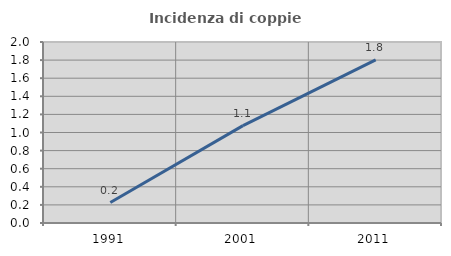
| Category | Incidenza di coppie miste |
|---|---|
| 1991.0 | 0.227 |
| 2001.0 | 1.076 |
| 2011.0 | 1.802 |